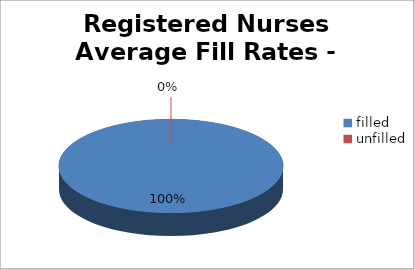
| Category | Series 0 |
|---|---|
| filled  | 100 |
| unfilled | 0 |